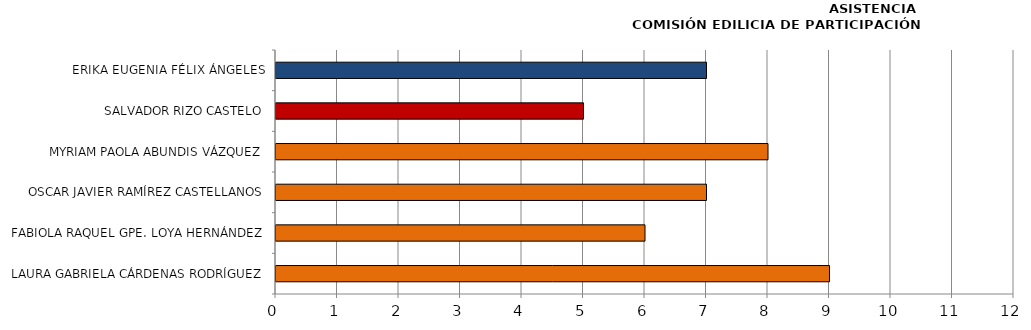
| Category | Series 0 |
|---|---|
| LAURA GABRIELA CÁRDENAS RODRÍGUEZ | 9 |
| FABIOLA RAQUEL GPE. LOYA HERNÁNDEZ | 6 |
| OSCAR JAVIER RAMÍREZ CASTELLANOS | 7 |
| MYRIAM PAOLA ABUNDIS VÁZQUEZ | 8 |
| SALVADOR RIZO CASTELO | 5 |
| ERIKA EUGENIA FÉLIX ÁNGELES | 7 |